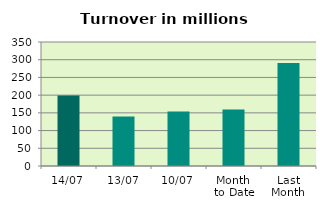
| Category | Series 0 |
|---|---|
| 14/07 | 198.648 |
| 13/07 | 139.485 |
| 10/07 | 153.878 |
| Month 
to Date | 159.491 |
| Last
Month | 290.981 |